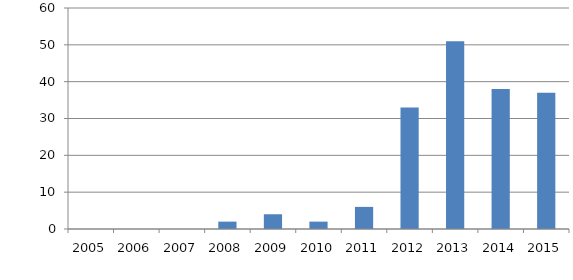
| Category | Series 0 |
|---|---|
| 2005.0 | 0 |
| 2006.0 | 0 |
| 2007.0 | 0 |
| 2008.0 | 2 |
| 2009.0 | 4 |
| 2010.0 | 2 |
| 2011.0 | 6 |
| 2012.0 | 33 |
| 2013.0 | 51 |
| 2014.0 | 38 |
| 2015.0 | 37 |